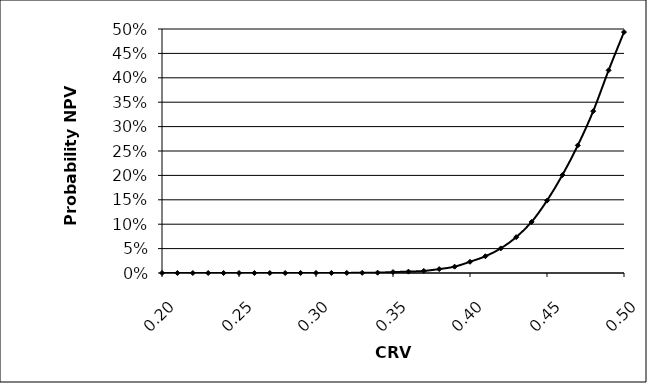
| Category | Series 0 |
|---|---|
| 0.2 | 0 |
| 0.21 | 0 |
| 0.22 | 0 |
| 0.23 | 0 |
| 0.24 | 0 |
| 0.25 | 0 |
| 0.26 | 0 |
| 0.27 | 0 |
| 0.28 | 0 |
| 0.29 | 0 |
| 0.3 | 0 |
| 0.31 | 0 |
| 0.32 | 0 |
| 0.33 | 0 |
| 0.34 | 0.001 |
| 0.35 | 0.002 |
| 0.36 | 0.003 |
| 0.37 | 0.004 |
| 0.38 | 0.008 |
| 0.39 | 0.013 |
| 0.4 | 0.023 |
| 0.41 | 0.034 |
| 0.42 | 0.05 |
| 0.43 | 0.073 |
| 0.44 | 0.105 |
| 0.45 | 0.148 |
| 0.46 | 0.201 |
| 0.47 | 0.262 |
| 0.48 | 0.332 |
| 0.49 | 0.415 |
| 0.5 | 0.494 |